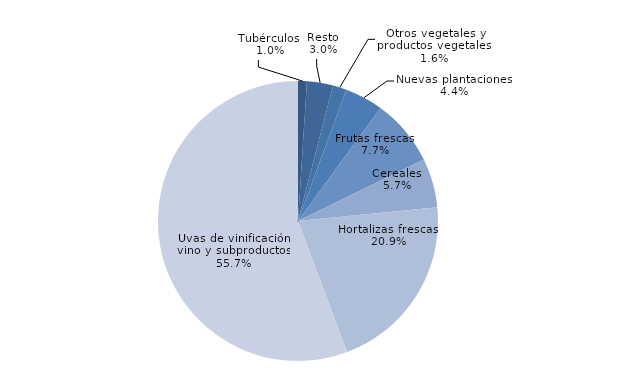
| Category | Series 0 |
|---|---|
| Tubérculos  | 5853.88 |
| Resto | 17342.8 |
| Otros vegetales y productos vegetales  | 9116.9 |
| Nuevas plantaciones  | 25343.64 |
| Frutas frescas  | 44517.29 |
| Cereales  | 32508.18 |
| Hortalizas frescas  | 119974.99 |
| Uvas de vinificación, vino y subproductos  | 320218.66 |